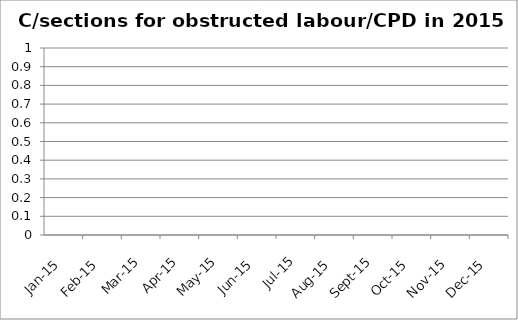
| Category | 0 0 0 0 0 0 0 0 0 0 0 0 |
|---|---|
| 2015-01-01 | 0 |
| 2015-02-01 | 0 |
| 2015-03-01 | 0 |
| 2015-04-01 | 0 |
| 2015-05-01 | 0 |
| 2015-06-01 | 0 |
| 2015-07-01 | 0 |
| 2015-08-01 | 0 |
| 2015-09-01 | 0 |
| 2015-10-01 | 0 |
| 2015-11-01 | 0 |
| 2015-12-01 | 0 |